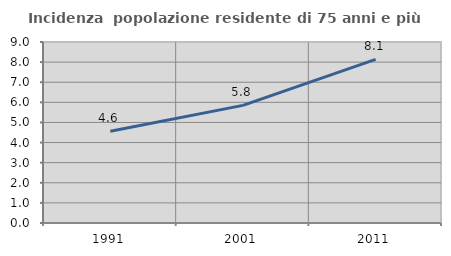
| Category | Incidenza  popolazione residente di 75 anni e più |
|---|---|
| 1991.0 | 4.563 |
| 2001.0 | 5.848 |
| 2011.0 | 8.139 |